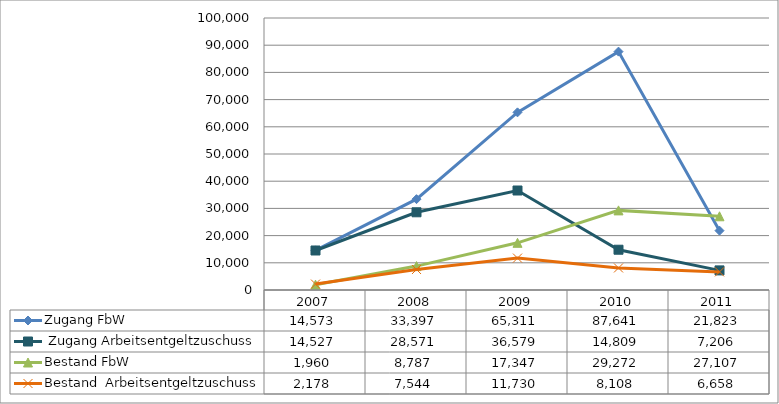
| Category | Zugang FbW |  Zugang Arbeitsentgeltzuschuss | Bestand FbW | Bestand  Arbeitsentgeltzuschuss |
|---|---|---|---|---|
| 2007.0 | 14573 | 14527 | 1960 | 2178 |
| 2008.0 | 33397 | 28571 | 8787 | 7544 |
| 2009.0 | 65311 | 36579 | 17347 | 11730 |
| 2010.0 | 87641 | 14809 | 29272 | 8108 |
| 2011.0 | 21823 | 7206 | 27107 | 6658 |